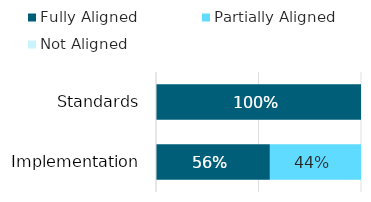
| Category | Fully Aligned | Partially Aligned | Not Aligned |
|---|---|---|---|
| Standards | 1 | 0 | 0 |
| Implementation | 0.556 | 0.444 | 0 |